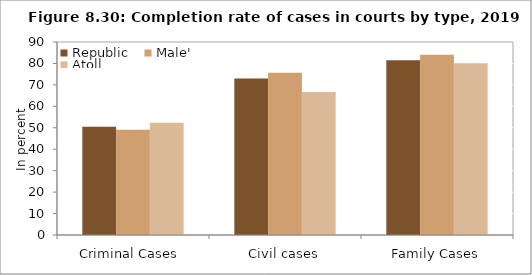
| Category | Republic  | Male'  | Atoll  |
|---|---|---|---|
| Criminal Cases  | 50.421 | 49.103 | 52.296 |
| Civil cases | 72.97 | 75.714 | 66.714 |
| Family Cases | 81.435 | 84.032 | 80.083 |